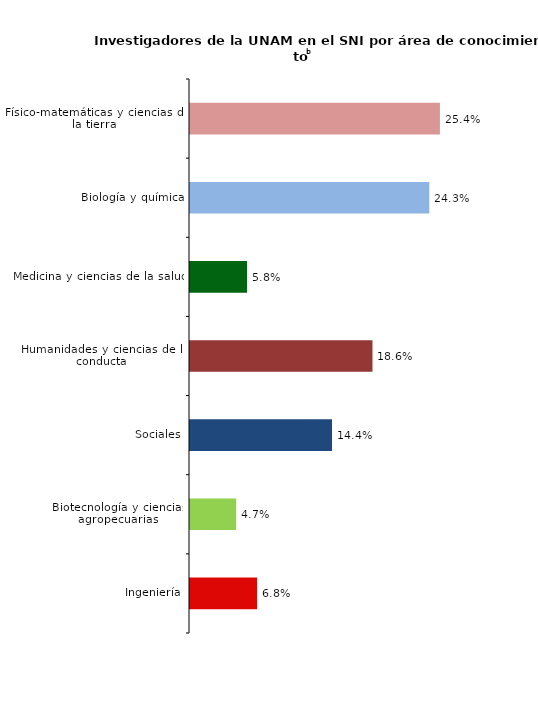
| Category | Series 0 |
|---|---|
| Ingeniería | 0.068 |
| Biotecnología y ciencias agropecuarias | 0.047 |
| Sociales | 0.144 |
| Humanidades y ciencias de la conducta | 0.186 |
| Medicina y ciencias de la salud | 0.058 |
| Biología y química | 0.243 |
| Físico-matemáticas y ciencias de la tierra | 0.254 |